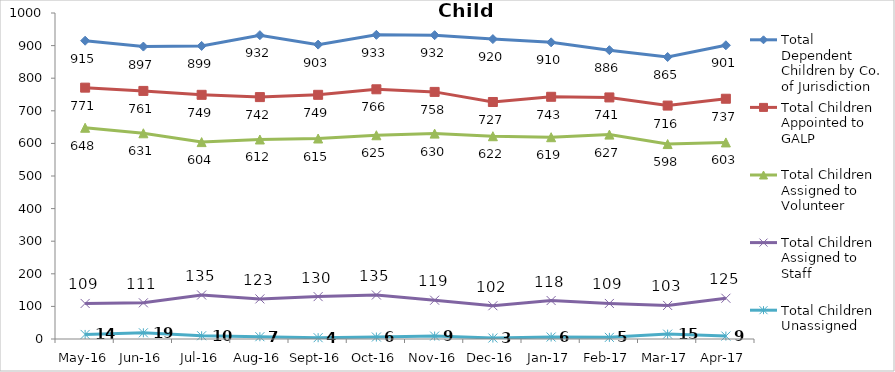
| Category | Total Dependent Children by Co. of Jurisdiction | Total Children Appointed to GALP | Total Children Assigned to Volunteer | Total Children Assigned to Staff | Total Children Unassigned |
|---|---|---|---|---|---|
| May-16 | 915 | 771 | 648 | 109 | 14 |
| Jun-16 | 897 | 761 | 631 | 111 | 19 |
| Jul-16 | 899 | 749 | 604 | 135 | 10 |
| Aug-16 | 932 | 742 | 612 | 123 | 7 |
| Sep-16 | 903 | 749 | 615 | 130 | 4 |
| Oct-16 | 933 | 766 | 625 | 135 | 6 |
| Nov-16 | 932 | 758 | 630 | 119 | 9 |
| Dec-16 | 920 | 727 | 622 | 102 | 3 |
| Jan-17 | 910 | 743 | 619 | 118 | 6 |
| Feb-17 | 886 | 741 | 627 | 109 | 5 |
| Mar-17 | 865 | 716 | 598 | 103 | 15 |
| Apr-17 | 901 | 737 | 603 | 125 | 9 |